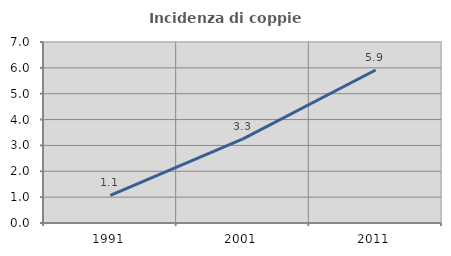
| Category | Incidenza di coppie miste |
|---|---|
| 1991.0 | 1.066 |
| 2001.0 | 3.253 |
| 2011.0 | 5.918 |